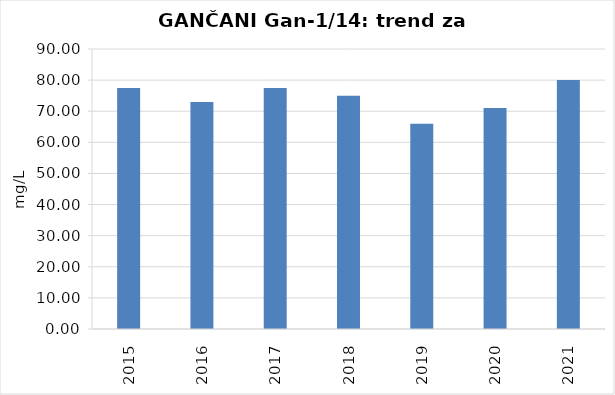
| Category | Vsota |
|---|---|
| 2015 | 77.5 |
| 2016 | 73 |
| 2017 | 77.5 |
| 2018 | 75 |
| 2019 | 66 |
| 2020 | 71 |
| 2021 | 80 |